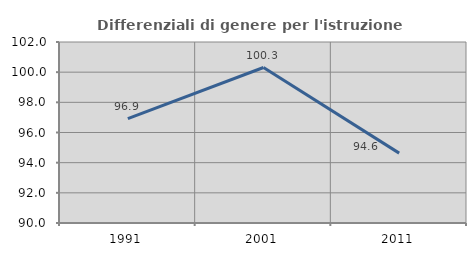
| Category | Differenziali di genere per l'istruzione superiore |
|---|---|
| 1991.0 | 96.921 |
| 2001.0 | 100.307 |
| 2011.0 | 94.633 |